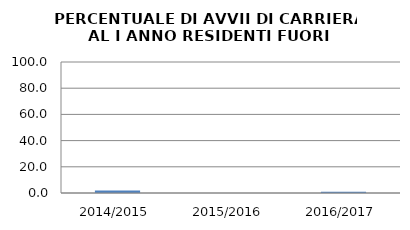
| Category | 2014/2015 2015/2016 2016/2017 |
|---|---|
| 2014/2015 | 1.942 |
| 2015/2016 | 0 |
| 2016/2017 | 0.98 |